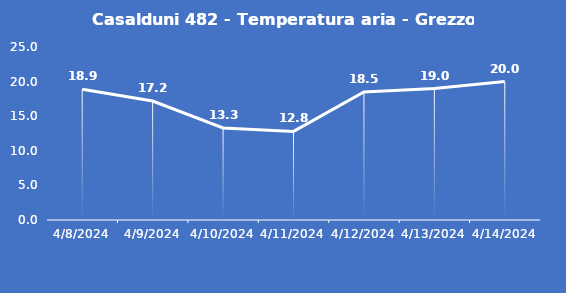
| Category | Casalduni 482 - Temperatura aria - Grezzo (°C) |
|---|---|
| 4/8/24 | 18.9 |
| 4/9/24 | 17.2 |
| 4/10/24 | 13.3 |
| 4/11/24 | 12.8 |
| 4/12/24 | 18.5 |
| 4/13/24 | 19 |
| 4/14/24 | 20 |